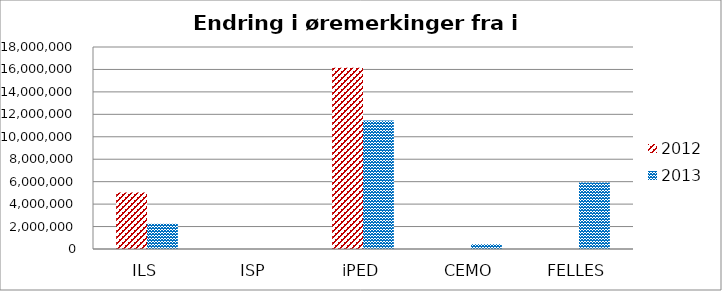
| Category | 2012 | 2013 |
|---|---|---|
| ILS | 5027000 | 2250000 |
| ISP | 0 | 0 |
| iPED | 16156547 | 11453785 |
| CEMO | 0 | 430000 |
| FELLES | 0 | 5925000 |